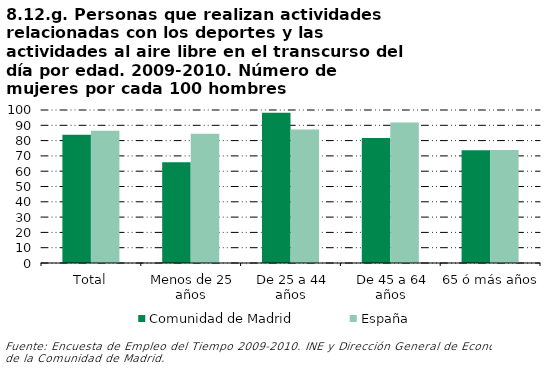
| Category | Comunidad de Madrid | España |
|---|---|---|
| Total | 83.836 | 86.417 |
| Menos de 25 años | 65.924 | 84.419 |
| De 25 a 44 años | 98.234 | 87.209 |
| De 45 a 64 años | 81.639 | 91.841 |
| 65 ó más años | 73.657 | 73.864 |